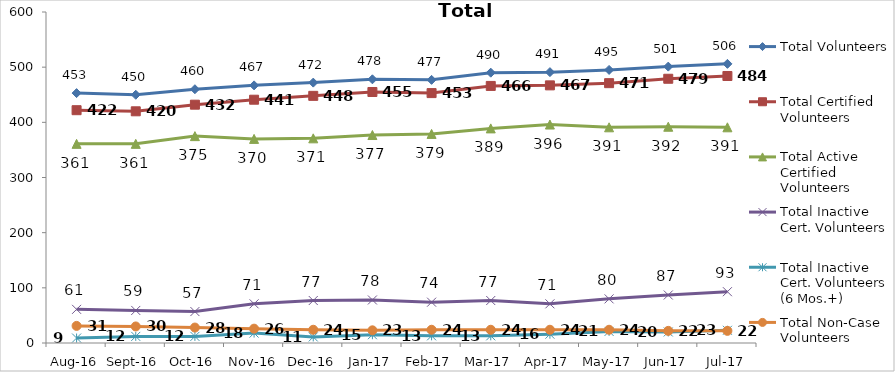
| Category | Total Volunteers | Total Certified Volunteers | Total Active Certified Volunteers | Total Inactive Cert. Volunteers | Total Inactive Cert. Volunteers (6 Mos.+) | Total Non-Case Volunteers |
|---|---|---|---|---|---|---|
| Aug-16 | 453 | 422 | 361 | 61 | 9 | 31 |
| Sep-16 | 450 | 420 | 361 | 59 | 12 | 30 |
| Oct-16 | 460 | 432 | 375 | 57 | 12 | 28 |
| Nov-16 | 467 | 441 | 370 | 71 | 18 | 26 |
| Dec-16 | 472 | 448 | 371 | 77 | 11 | 24 |
| Jan-17 | 478 | 455 | 377 | 78 | 15 | 23 |
| Feb-17 | 477 | 453 | 379 | 74 | 13 | 24 |
| Mar-17 | 490 | 466 | 389 | 77 | 13 | 24 |
| Apr-17 | 491 | 467 | 396 | 71 | 16 | 24 |
| May-17 | 495 | 471 | 391 | 80 | 21 | 24 |
| Jun-17 | 501 | 479 | 392 | 87 | 20 | 22 |
| Jul-17 | 506 | 484 | 391 | 93 | 23 | 22 |